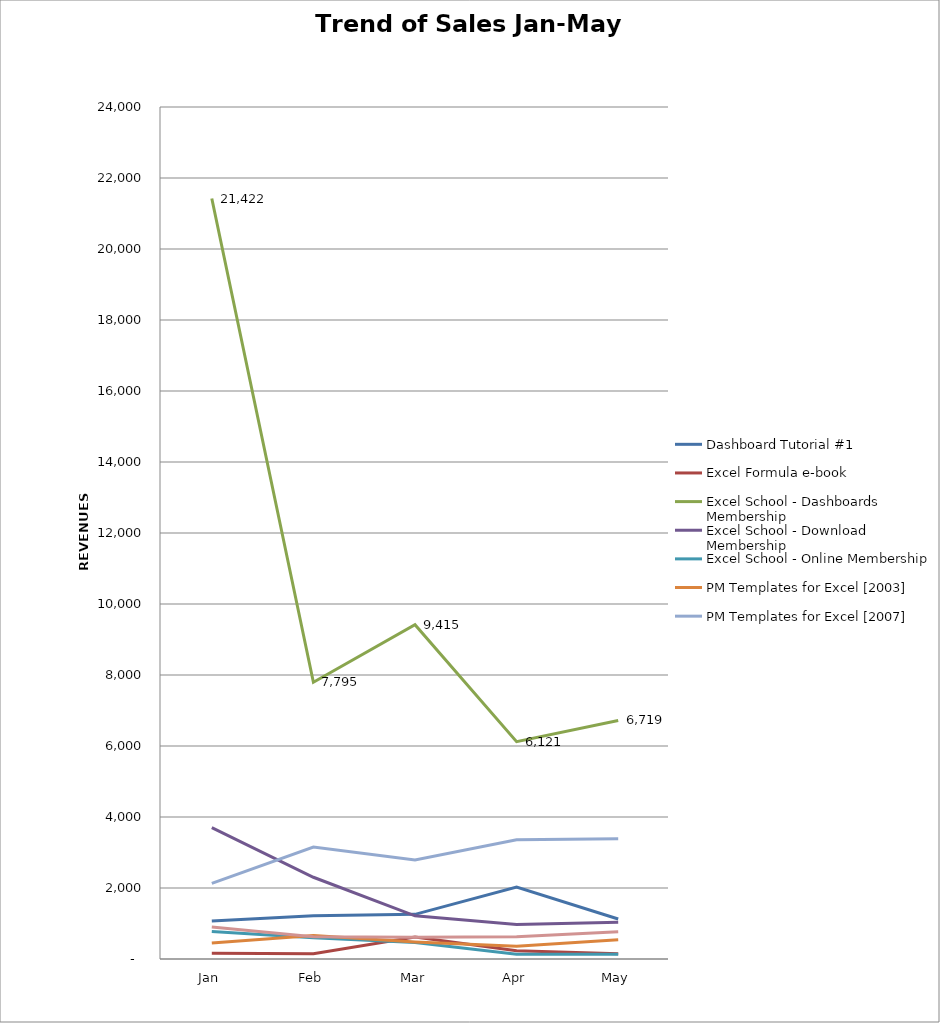
| Category | Dashboard Tutorial #1 | Excel Formula e-book | Excel School - Dashboards Membership | Excel School - Download Membership | Excel School - Online Membership | PM Templates for Excel [2003] | PM Templates for Excel [2007] | PM Templates for Excel [both] |
|---|---|---|---|---|---|---|---|---|
|  Jan  | 1073 | 160 | 21422.1 | 3702.75 | 774 | 450 | 2130 | 900 |
|  Feb  | 1221 | 150 | 7795.2 | 2302.5 | 602 | 660 | 3151.47 | 630 |
|  Mar  | 1258 | 620 | 9414.84 | 1216.6 | 462.3 | 480 | 2791.21 | 615 |
|  Apr  | 2027.6 | 230 | 6120.9 | 970 | 134 | 360 | 3360 | 630 |
|  May  | 1128 | 150 | 6718.6 | 1037.9 | 134 | 540 | 3390 | 765 |